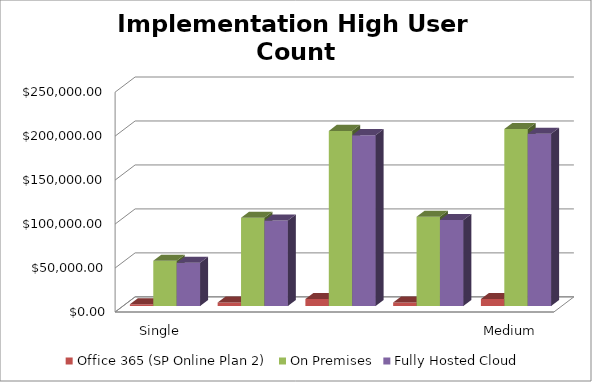
| Category | Office 365 (SP Online Plan 2) | On Premises | Fully Hosted Cloud |
|---|---|---|---|
| Single Server Install (WFE and SQL on 1 VM) | 2000 | 51446.269 | 49170 |
| Small Farm - Two Server Install (WFE and SQL) | 4000 | 100334.608 | 97160 |
| Small Farm w/ High Availability (2 WFE - 2 SQL) | 8000 | 199152.043 | 194325 |
| Medium Farm (1 WFE, 1 App/Index, 1 SQL) | 4000 | 101407.455 | 97860 |
| Medium Farm w/ High Availability (2 WFE, 2 A/I, 2 SQL) | 8000 | 201371.894 | 195915 |